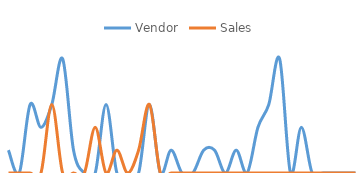
| Category | Vendor | Sales |
|---|---|---|
| 0 | 1 | 0 |
| 1 | 0 | 0 |
| 2 | 3 | 0 |
| 3 | 2 | 0 |
| 4 | 3 | 3 |
| 5 | 5 | 0 |
| 6 | 1 | 0 |
| 7 | 0 | 0 |
| 8 | 0 | 2 |
| 9 | 3 | 0 |
| 10 | 0 | 1 |
| 11 | 0 | 0 |
| 12 | 0 | 1 |
| 13 | 3 | 3 |
| 14 | 0 | 0 |
| 15 | 1 | 0 |
| 16 | 0 | 0 |
| 17 | 0 | 0 |
| 18 | 1 | 0 |
| 19 | 1 | 0 |
| 20 | 0 | 0 |
| 21 | 1 | 0 |
| 22 | 0 | 0 |
| 23 | 2 | 0 |
| 24 | 3 | 0 |
| 25 | 5 | 0 |
| 26 | 0 | 0 |
| 27 | 2 | 0 |
| 28 | 0 | 0 |
| 29 | 0 | 0 |
| 30 | 0 | 0 |
| 31 | 0 | 0 |
| 32 | 0 | 0 |